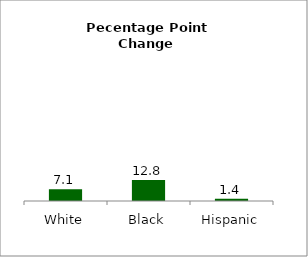
| Category | Series 0 |
|---|---|
| White | 7.1 |
| Black | 12.815 |
| Hispanic | 1.361 |